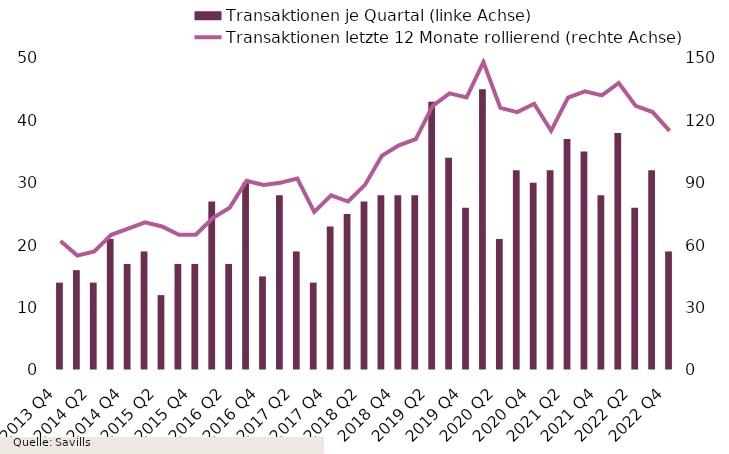
| Category | Transaktionen je Quartal (linke Achse) |
|---|---|
| 2013 Q4 | 14 |
| 2014 Q1 | 16 |
| 2014 Q2 | 14 |
| 2014 Q3 | 21 |
| 2014 Q4 | 17 |
| 2015 Q1 | 19 |
| 2015 Q2 | 12 |
| 2015 Q3 | 17 |
| 2015 Q4 | 17 |
| 2016 Q1 | 27 |
| 2016 Q2 | 17 |
| 2016 Q3 | 30 |
| 2016 Q4 | 15 |
| 2017 Q1 | 28 |
| 2017 Q2 | 19 |
| 2017 Q3 | 14 |
| 2017 Q4 | 23 |
| 2018 Q1 | 25 |
| 2018 Q2 | 27 |
| 2018 Q3 | 28 |
| 2018 Q4 | 28 |
| 2019 Q1 | 28 |
| 2019 Q2 | 43 |
| 2019 Q3 | 34 |
| 2019 Q4 | 26 |
| 2020 Q1 | 45 |
| 2020 Q2 | 21 |
| 2020 Q3 | 32 |
| 2020 Q4 | 30 |
| 2021 Q1 | 32 |
| 2021 Q2 | 37 |
| 2021 Q3 | 35 |
| 2021 Q4 | 28 |
| 2022 Q1 | 38 |
| 2022 Q2 | 26 |
| 2022 Q3 | 32 |
| 2022 Q4 | 19 |